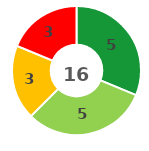
| Category | Series 0 |
|---|---|
| 0 | 5 |
| 1 | 5 |
| 2 | 3 |
| 3 | 3 |
| 4 | 0 |